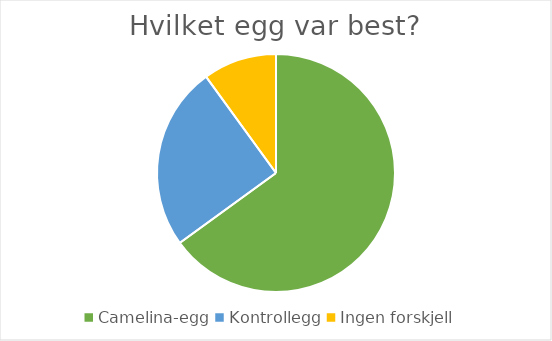
| Category | Series 0 |
|---|---|
| Camelina-egg | 13 |
| Kontrollegg | 5 |
| Ingen forskjell  | 2 |